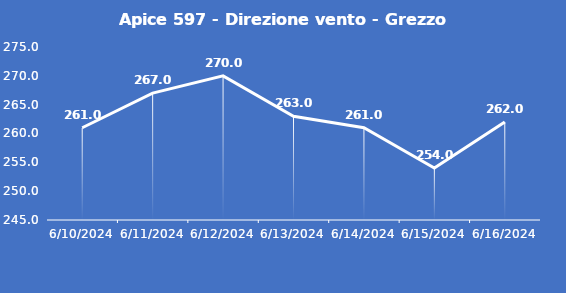
| Category | Apice 597 - Direzione vento - Grezzo (°N) |
|---|---|
| 6/10/24 | 261 |
| 6/11/24 | 267 |
| 6/12/24 | 270 |
| 6/13/24 | 263 |
| 6/14/24 | 261 |
| 6/15/24 | 254 |
| 6/16/24 | 262 |